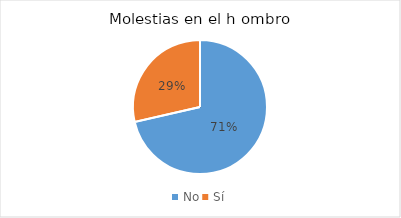
| Category | Series 0 |
|---|---|
| No | 5 |
| Sí | 2 |